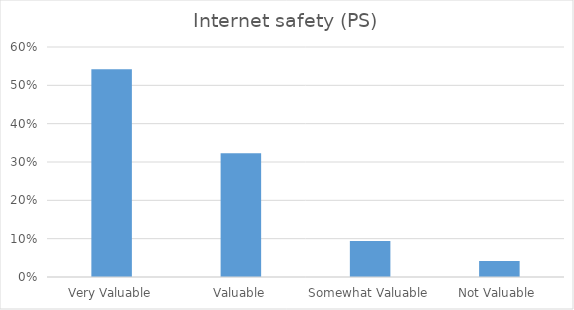
| Category | Internet safety (PS) |
|---|---|
| Very Valuable | 0.542 |
| Valuable | 0.323 |
| Somewhat Valuable | 0.094 |
| Not Valuable | 0.042 |